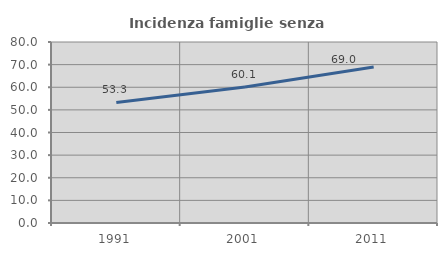
| Category | Incidenza famiglie senza nuclei |
|---|---|
| 1991.0 | 53.275 |
| 2001.0 | 60.085 |
| 2011.0 | 68.991 |